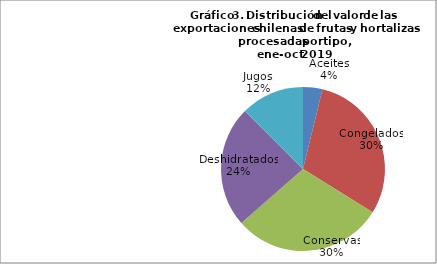
| Category | Series 0 |
|---|---|
| Aceites | 47787732.43 |
| Congelados | 375573005.04 |
| Conservas | 371255790.78 |
| Deshidratados | 299430751.1 |
| Jugos | 156710901.93 |